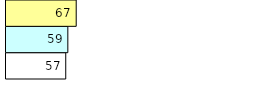
| Category | Total Standouts | Total Recd | Total Tipsters |
|---|---|---|---|
| 0 | 57 | 59 | 67 |